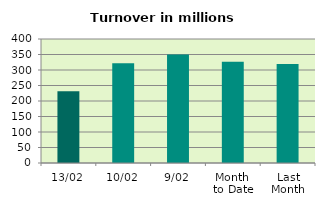
| Category | Series 0 |
|---|---|
| 13/02 | 231.429 |
| 10/02 | 322.138 |
| 9/02 | 350.048 |
| Month 
to Date | 326.289 |
| Last
Month | 318.977 |